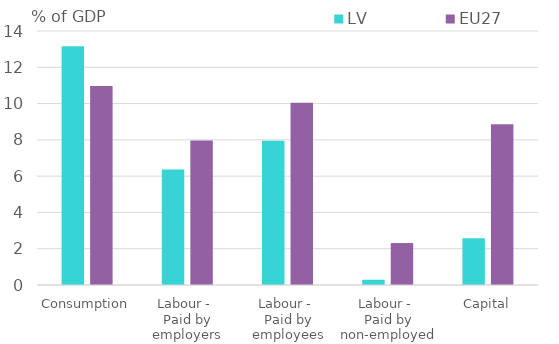
| Category | LV | EU27 |
|---|---|---|
| Consumption | 13.158 | 10.967 |
| Labour - 
Paid by employers | 6.361 | 7.966 |
| Labour - 
Paid by employees | 7.954 | 10.052 |
| Labour - 
Paid by non-employed | 0.289 | 2.311 |
| Capital | 2.577 | 8.858 |